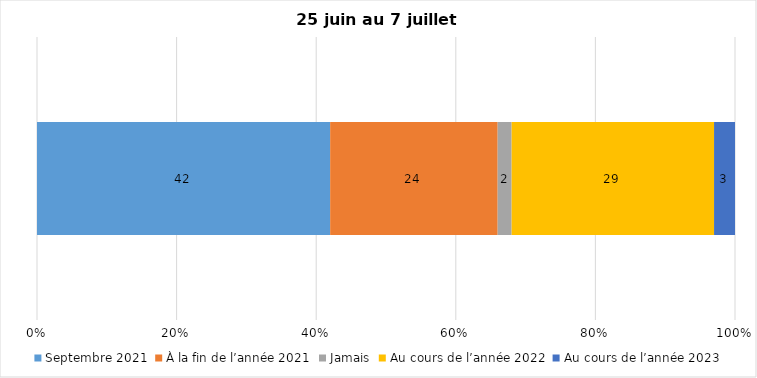
| Category | Septembre 2021 | À la fin de l’année 2021 | Jamais | Au cours de l’année 2022 | Au cours de l’année 2023 |
|---|---|---|---|---|---|
| 0 | 42 | 24 | 2 | 29 | 3 |